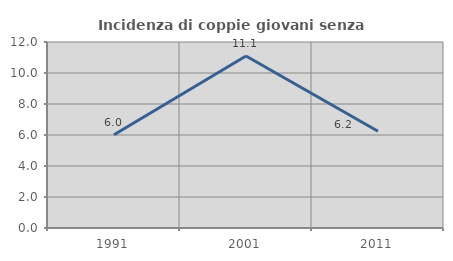
| Category | Incidenza di coppie giovani senza figli |
|---|---|
| 1991.0 | 6.021 |
| 2001.0 | 11.095 |
| 2011.0 | 6.24 |